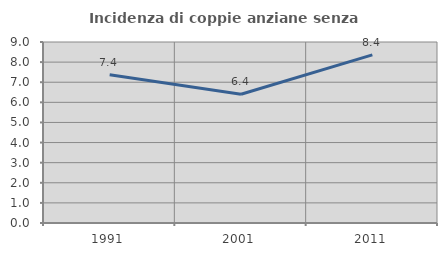
| Category | Incidenza di coppie anziane senza figli  |
|---|---|
| 1991.0 | 7.371 |
| 2001.0 | 6.405 |
| 2011.0 | 8.362 |